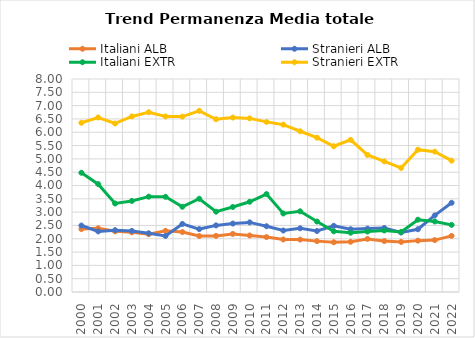
| Category | Italiani ALB | Stranieri ALB | Italiani EXTR | Stranieri EXTR |
|---|---|---|---|---|
| 2000.0 | 2.362 | 2.497 | 4.479 | 6.355 |
| 2001.0 | 2.393 | 2.276 | 4.05 | 6.555 |
| 2002.0 | 2.28 | 2.323 | 3.324 | 6.329 |
| 2003.0 | 2.243 | 2.295 | 3.42 | 6.595 |
| 2004.0 | 2.169 | 2.206 | 3.582 | 6.752 |
| 2005.0 | 2.299 | 2.106 | 3.576 | 6.593 |
| 2006.0 | 2.251 | 2.556 | 3.202 | 6.587 |
| 2007.0 | 2.102 | 2.363 | 3.502 | 6.805 |
| 2008.0 | 2.106 | 2.501 | 3.017 | 6.489 |
| 2009.0 | 2.182 | 2.57 | 3.193 | 6.552 |
| 2010.0 | 2.123 | 2.614 | 3.39 | 6.521 |
| 2011.0 | 2.062 | 2.47 | 3.677 | 6.389 |
| 2012.0 | 1.973 | 2.308 | 2.948 | 6.285 |
| 2013.0 | 1.969 | 2.393 | 3.031 | 6.037 |
| 2014.0 | 1.911 | 2.29 | 2.647 | 5.796 |
| 2015.0 | 1.869 | 2.485 | 2.278 | 5.474 |
| 2016.0 | 1.886 | 2.357 | 2.227 | 5.715 |
| 2017.0 | 1.993 | 2.381 | 2.27 | 5.148 |
| 2018.0 | 1.913 | 2.405 | 2.311 | 4.906 |
| 2019.0 | 1.882 | 2.232 | 2.256 | 4.66 |
| 2020.0 | 1.929 | 2.357 | 2.716 | 5.345 |
| 2021.0 | 1.95 | 2.878 | 2.649 | 5.272 |
| 2022.0 | 2.109 | 3.35 | 2.521 | 4.933 |